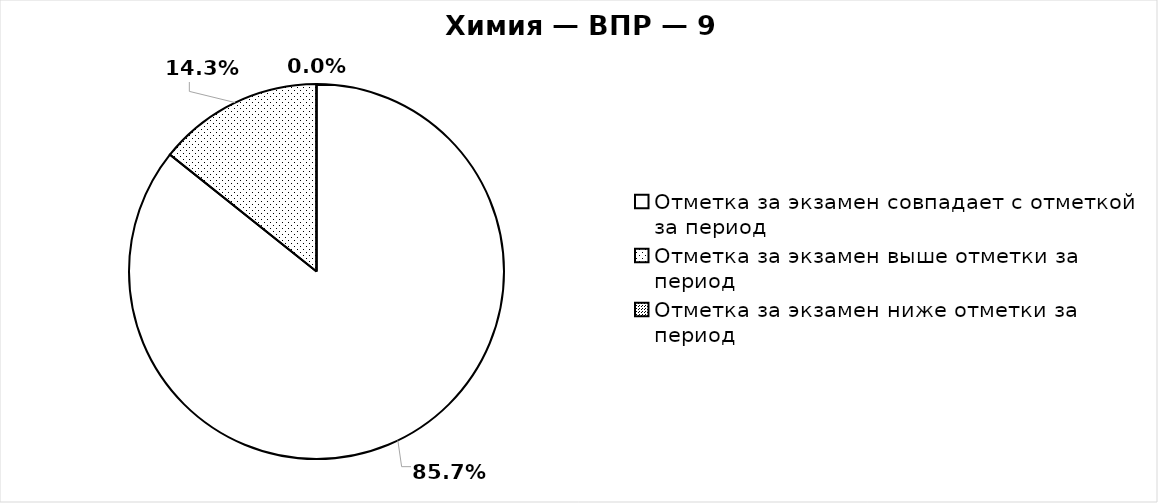
| Category | Отметка за экзамен совпадает с отметкой за период Отметка за экзамен выше отметки за период Отметка за экзамен ниже отметки за период |
|---|---|
| Отметка за экзамен совпадает с отметкой за период | 0.857 |
| Отметка за экзамен выше отметки за период | 0.143 |
| Отметка за экзамен ниже отметки за период | 0 |